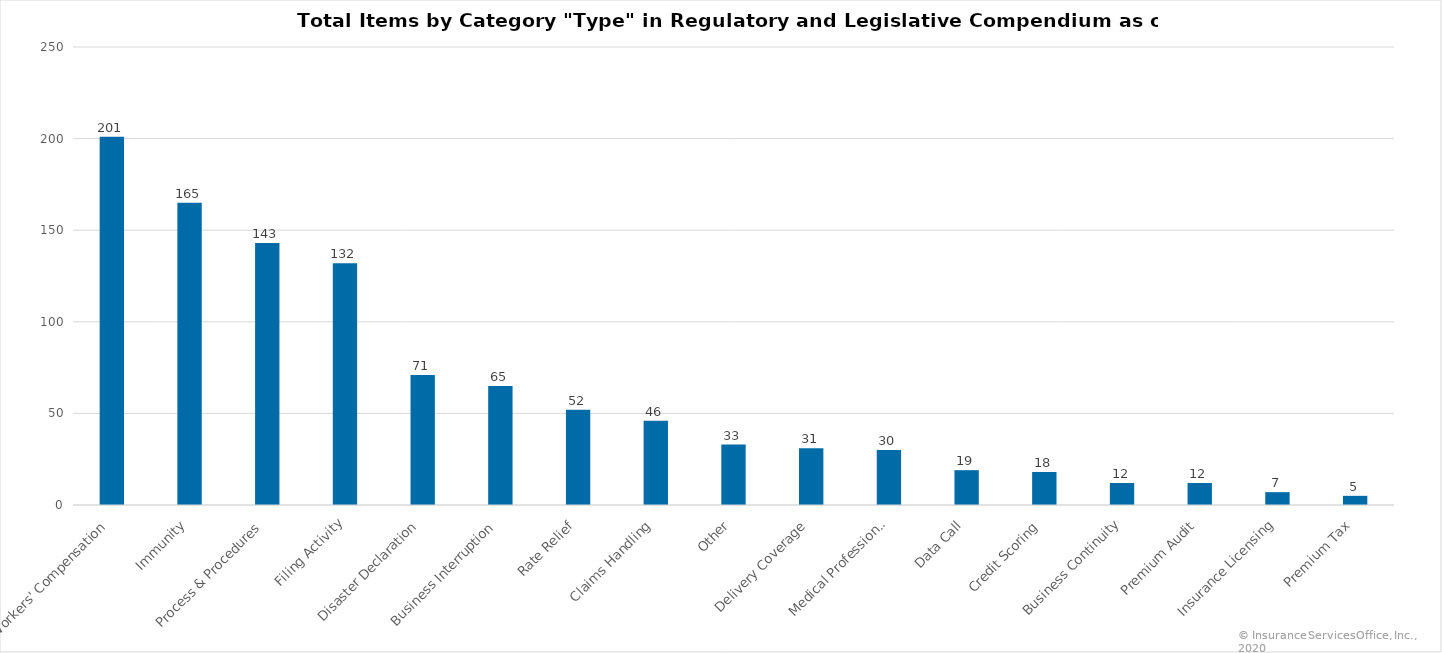
| Category | Count |
|---|---|
| Workers' Compensation | 201 |
| Immunity | 165 |
| Process & Procedures | 143 |
| Filing Activity | 132 |
| Disaster Declaration | 71 |
| Business Interruption | 65 |
| Rate Relief | 52 |
| Claims Handling | 46 |
| Other | 33 |
| Delivery Coverage | 31 |
| Medical Professional | 30 |
| Data Call | 19 |
| Credit Scoring | 18 |
| Business Continuity | 12 |
| Premium Audit | 12 |
| Insurance Licensing | 7 |
| Premium Tax | 5 |